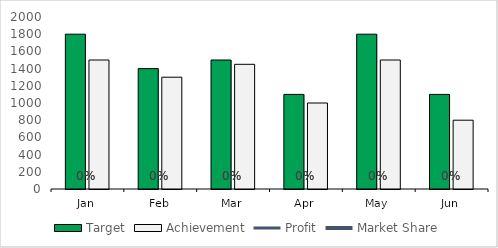
| Category | Target | Achievement |
|---|---|---|
| Jan | 1800 | 1500 |
| Feb | 1400 | 1300 |
| Mar | 1500 | 1450 |
| Apr | 1100 | 1000 |
| May | 1800 | 1500 |
| Jun | 1100 | 800 |